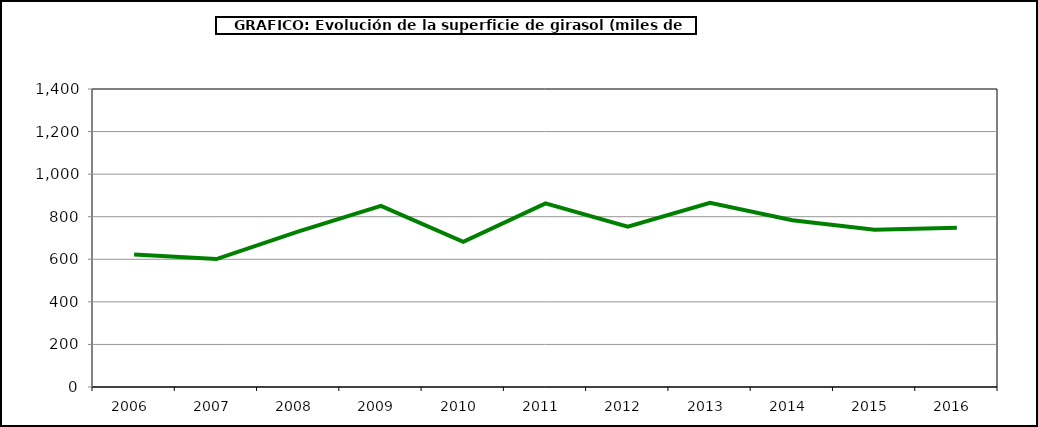
| Category | Superficie |
|---|---|
| 2006.0 | 622.494 |
| 2007.0 | 600.866 |
| 2008.0 | 730.819 |
| 2009.0 | 851.12 |
| 2010.0 | 682.522 |
| 2011.0 | 862.869 |
| 2012.0 | 753.015 |
| 2013.0 | 865.564 |
| 2014.0 | 783.425 |
| 2015.0 | 738.851 |
| 2016.0 | 747.672 |